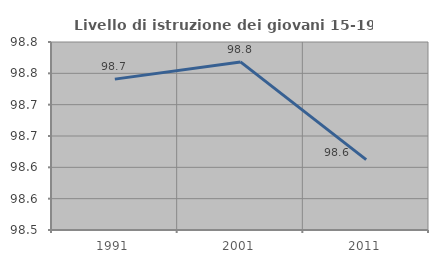
| Category | Livello di istruzione dei giovani 15-19 anni |
|---|---|
| 1991.0 | 98.741 |
| 2001.0 | 98.768 |
| 2011.0 | 98.612 |